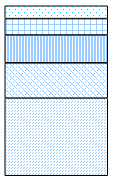
| Category | 65-70 | 70-75 | 75-80 | 80-85 | 85 und mehr |
|---|---|---|---|---|---|
| 0 | 45.635 | 20.786 | 16.391 | 9.625 | 7.564 |